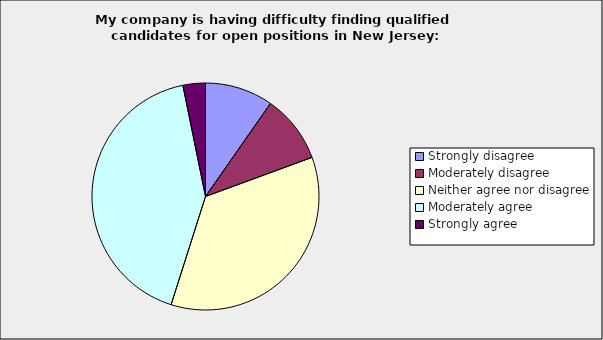
| Category | Series 0 |
|---|---|
| Strongly disagree | 0.097 |
| Moderately disagree | 0.097 |
| Neither agree nor disagree | 0.355 |
| Moderately agree | 0.419 |
| Strongly agree | 0.032 |